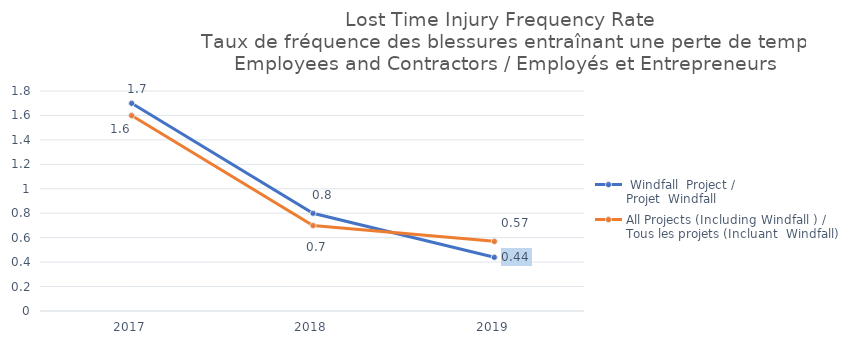
| Category |  Windfall  Project / 
Projet  Windfall | All Projects (Including Windfall ) / 
Tous les projets (Incluant  Windfall) |
|---|---|---|
| 2017 | 1.7 | 1.6 |
| 2018 | 0.8 | 0.7 |
| 2019 | 0.44 | 0.57 |